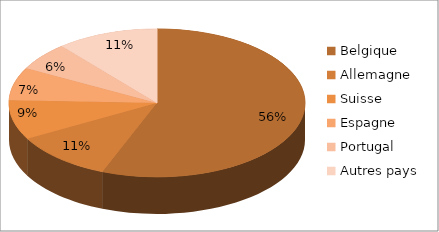
| Category | Series 0 |
|---|---|
| Belgique | 203472624.97 |
| Allemagne | 39722204.338 |
| Suisse | 31445584.461 |
| Espagne | 26206352.61 |
| Portugal | 22129684.56 |
| Autres pays | 40388450.537 |